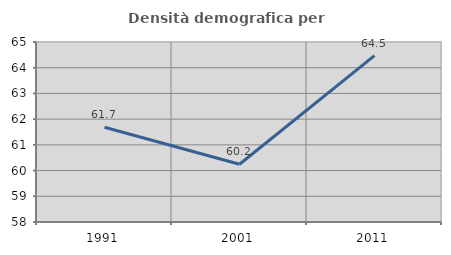
| Category | Densità demografica |
|---|---|
| 1991.0 | 61.684 |
| 2001.0 | 60.245 |
| 2011.0 | 64.471 |